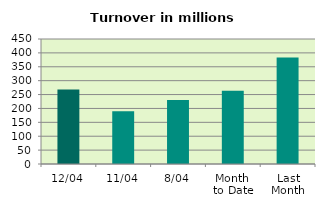
| Category | Series 0 |
|---|---|
| 12/04 | 268.018 |
| 11/04 | 190.226 |
| 8/04 | 230.663 |
| Month 
to Date | 263.447 |
| Last
Month | 383.695 |